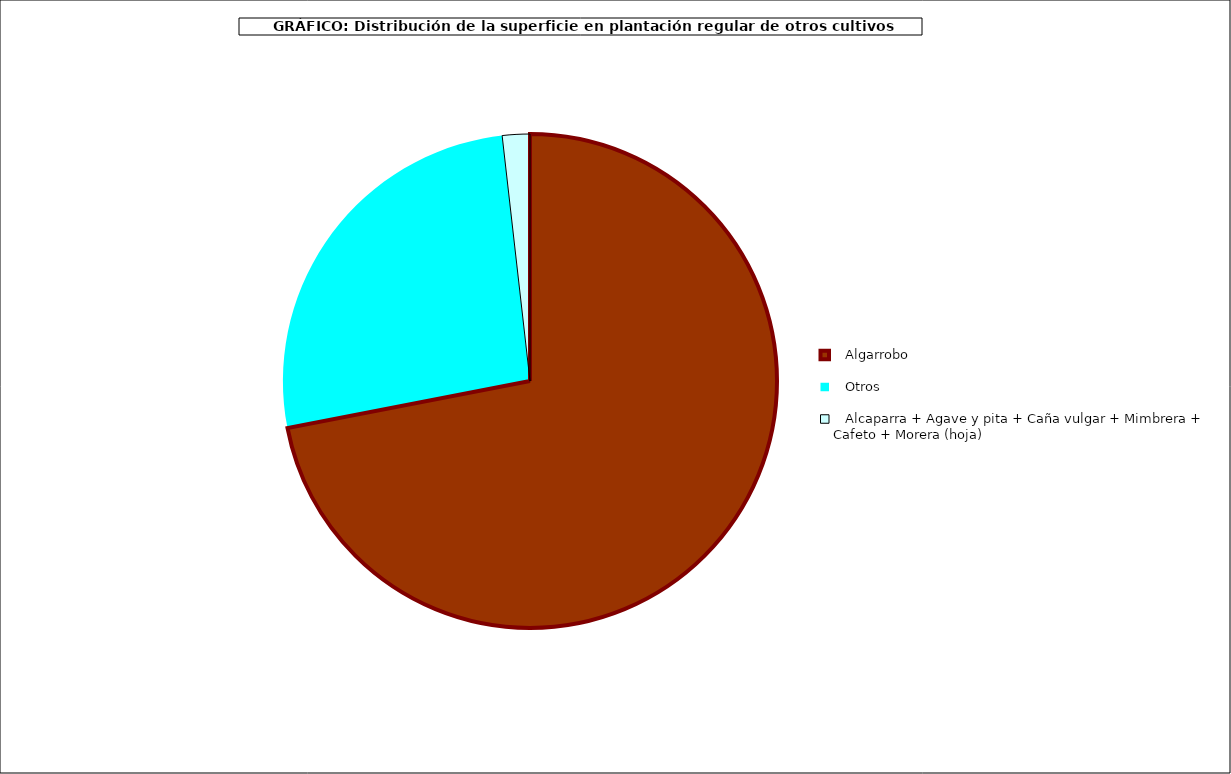
| Category | Series 0 |
|---|---|
|    Algarrobo  | 39626 |
|    Otros  | 14455 |
|    Alcaparra + Agave y pita + Caña vulgar + Mimbrera + Cafeto + Morera (hoja)  | 991 |